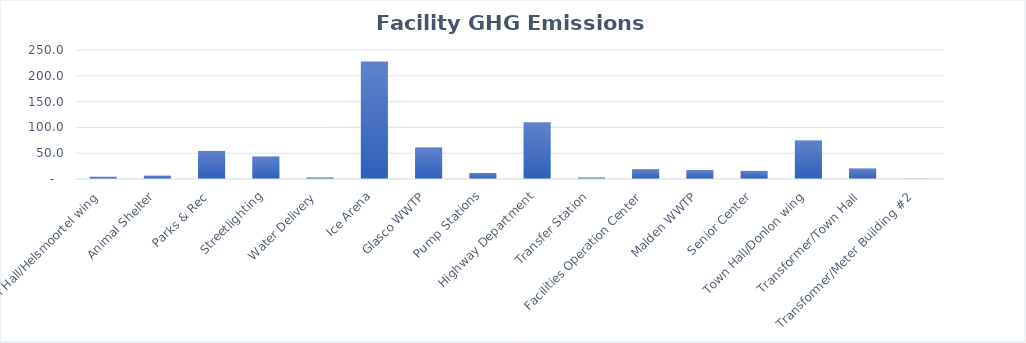
| Category | GHG Emissions (tons) |
|---|---|
| Town Hall/Helsmoortel wing | 4.289 |
| Animal Shelter | 6.377 |
| Parks & Rec | 54.383 |
| Streetlighting | 43.744 |
| Water Delivery | 3.138 |
| Ice Arena | 227.924 |
| Glasco WWTP | 61.281 |
| Pump Stations | 11.571 |
| Highway Department | 109.933 |
| Transfer Station | 3.017 |
| Facilities Operation Center | 19.083 |
| Malden WWTP | 17.351 |
| Senior Center | 15.722 |
| Town Hall/Donlon wing | 74.579 |
| Transformer/Town Hall | 20.293 |
| Transformer/Meter Building #2 | 0.322 |